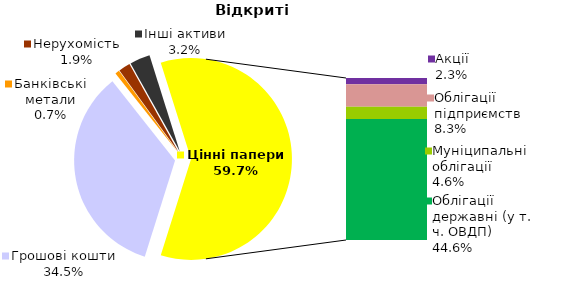
| Category | Відкриті |
|---|---|
| Грошові кошти | 527.633 |
| Банківські метали | 10.485 |
| Нерухомість | 28.596 |
| Інші активи | 49.695 |
| Акції | 34.851 |
| Облігації підприємств | 126.751 |
| Муніципальні облігації | 70.211 |
| Облігації державні (у т. ч. ОВДП) | 681.833 |